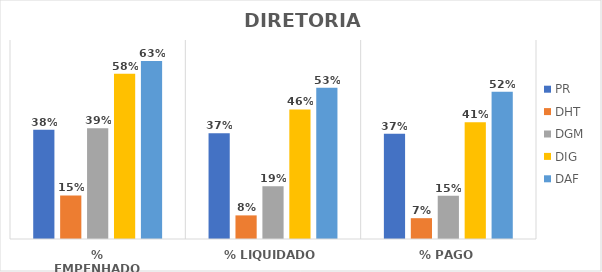
| Category | PR | DHT | DGM | DIG | DAF |
|---|---|---|---|---|---|
| % EMPENHADO | 0.384 | 0.153 | 0.389 | 0.582 | 0.626 |
| % LIQUIDADO | 0.372 | 0.083 | 0.185 | 0.456 | 0.532 |
| % PAGO | 0.37 | 0.073 | 0.152 | 0.411 | 0.518 |